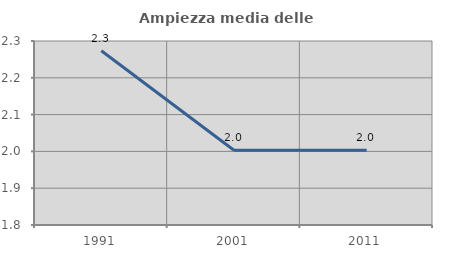
| Category | Ampiezza media delle famiglie |
|---|---|
| 1991.0 | 2.273 |
| 2001.0 | 2.003 |
| 2011.0 | 2.003 |